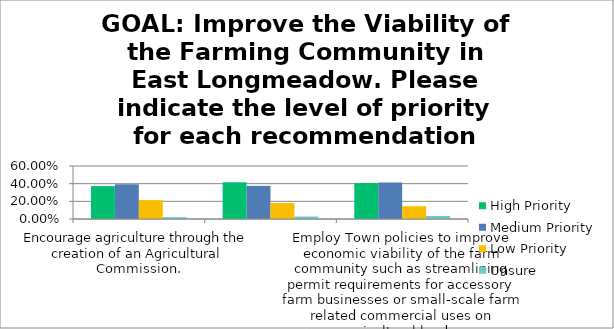
| Category | High Priority | Medium Priority | Low Priority | Unsure |
|---|---|---|---|---|
| Encourage agriculture through the creation of an Agricultural Commission. | 0.372 | 0.393 | 0.214 | 0.021 |
| Explore a Right-to-Farm Bylaw to protect farmlands by allowing agricultural uses and related activities to function with minimal conflict with abutters and Town agencies. | 0.417 | 0.375 | 0.181 | 0.028 |
| Employ Town policies to improve economic viability of the farm community such as streamlining permit requirements for accessory farm businesses or small-scale farm related commercial uses on agricultural lands. | 0.407 | 0.414 | 0.145 | 0.034 |